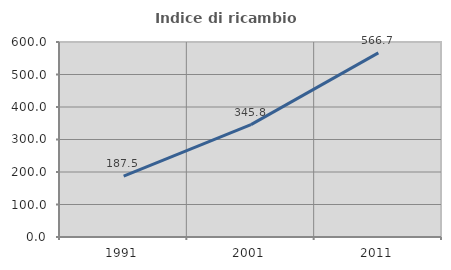
| Category | Indice di ricambio occupazionale  |
|---|---|
| 1991.0 | 187.5 |
| 2001.0 | 345.833 |
| 2011.0 | 566.667 |